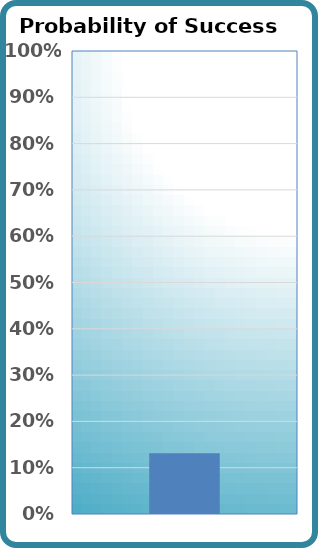
| Category | Probability of Success |
|---|---|
| 0 | 0.131 |